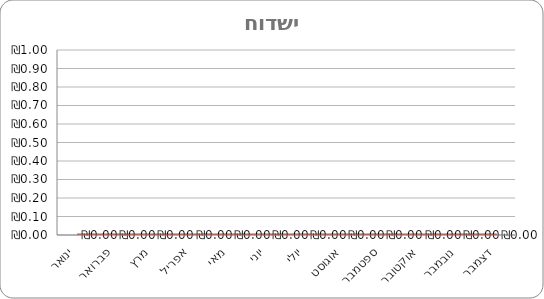
| Category | Series 0 |
|---|---|
| ינואר | 0 |
| פברואר | 0 |
| מרץ | 0 |
| אפריל | 0 |
| מאי | 0 |
| יוני | 0 |
| יולי | 0 |
| אוגוסט | 0 |
| ספטמבר | 0 |
| אוקטובר | 0 |
| נובמבר | 0 |
| דצמבר | 0 |